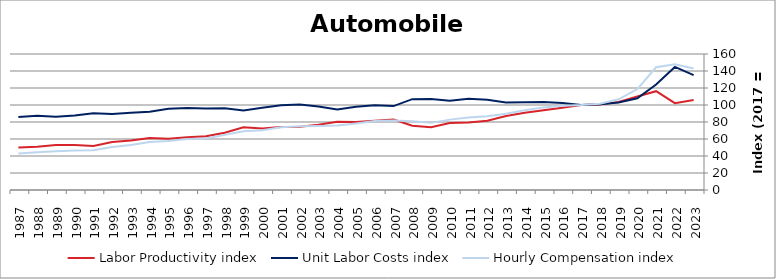
| Category | Labor Productivity index | Unit Labor Costs index | Hourly Compensation index |
|---|---|---|---|
| 2023.0 | 105.785 | 135.084 | 142.899 |
| 2022.0 | 102.122 | 144.786 | 147.858 |
| 2021.0 | 116.249 | 124.197 | 144.378 |
| 2020.0 | 110.009 | 107.972 | 118.779 |
| 2019.0 | 103.602 | 103.007 | 106.717 |
| 2018.0 | 100.698 | 100.76 | 101.463 |
| 2017.0 | 100 | 100 | 100 |
| 2016.0 | 96.871 | 102.396 | 99.192 |
| 2015.0 | 93.916 | 103.492 | 97.196 |
| 2014.0 | 90.916 | 103.297 | 93.914 |
| 2013.0 | 87.111 | 103.077 | 89.791 |
| 2012.0 | 81.559 | 106.246 | 86.653 |
| 2011.0 | 79.404 | 107.416 | 85.293 |
| 2010.0 | 78.772 | 105.116 | 82.802 |
| 2009.0 | 73.864 | 106.935 | 78.987 |
| 2008.0 | 75.648 | 106.907 | 80.873 |
| 2007.0 | 82.917 | 98.714 | 81.851 |
| 2006.0 | 81.459 | 99.651 | 81.174 |
| 2005.0 | 79.875 | 98.07 | 78.334 |
| 2004.0 | 80.207 | 94.679 | 75.939 |
| 2003.0 | 76.777 | 98.185 | 75.383 |
| 2002.0 | 74.545 | 100.498 | 74.916 |
| 2001.0 | 74.002 | 99.63 | 73.729 |
| 2000.0 | 72.476 | 96.845 | 70.189 |
| 1999.0 | 73.818 | 93.623 | 69.11 |
| 1998.0 | 67.457 | 96.123 | 64.842 |
| 1997.0 | 63.282 | 95.77 | 60.606 |
| 1996.0 | 62.026 | 96.584 | 59.907 |
| 1995.0 | 60.222 | 95.62 | 57.584 |
| 1994.0 | 61.254 | 92.071 | 56.397 |
| 1993.0 | 58.242 | 90.905 | 52.945 |
| 1992.0 | 56.536 | 89.282 | 50.476 |
| 1991.0 | 51.838 | 90.387 | 46.855 |
| 1990.0 | 53.07 | 87.581 | 46.479 |
| 1989.0 | 52.829 | 86.084 | 45.477 |
| 1988.0 | 50.774 | 87.353 | 44.353 |
| 1987.0 | 49.882 | 85.882 | 42.84 |